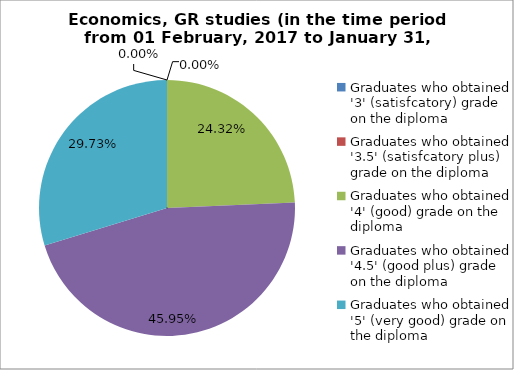
| Category | Series 0 |
|---|---|
| Graduates who obtained '3' (satisfcatory) grade on the diploma | 0 |
| Graduates who obtained '3.5' (satisfcatory plus) grade on the diploma | 0 |
| Graduates who obtained '4' (good) grade on the diploma | 24.324 |
| Graduates who obtained '4.5' (good plus) grade on the diploma | 45.946 |
| Graduates who obtained '5' (very good) grade on the diploma | 29.73 |